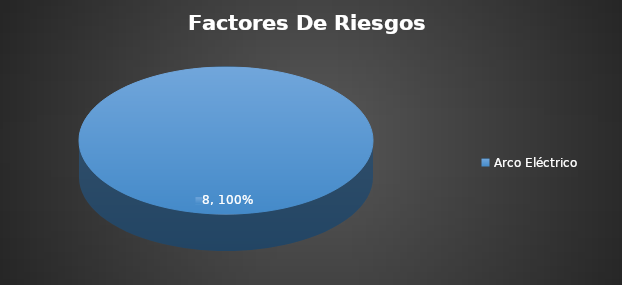
| Category | Total |
|---|---|
| Arco Eléctrico  | 8 |